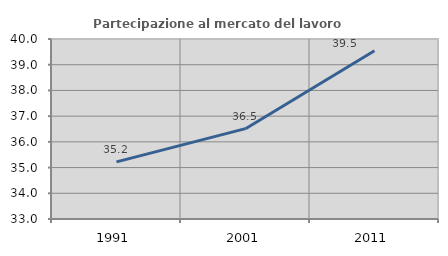
| Category | Partecipazione al mercato del lavoro  femminile |
|---|---|
| 1991.0 | 35.221 |
| 2001.0 | 36.513 |
| 2011.0 | 39.54 |